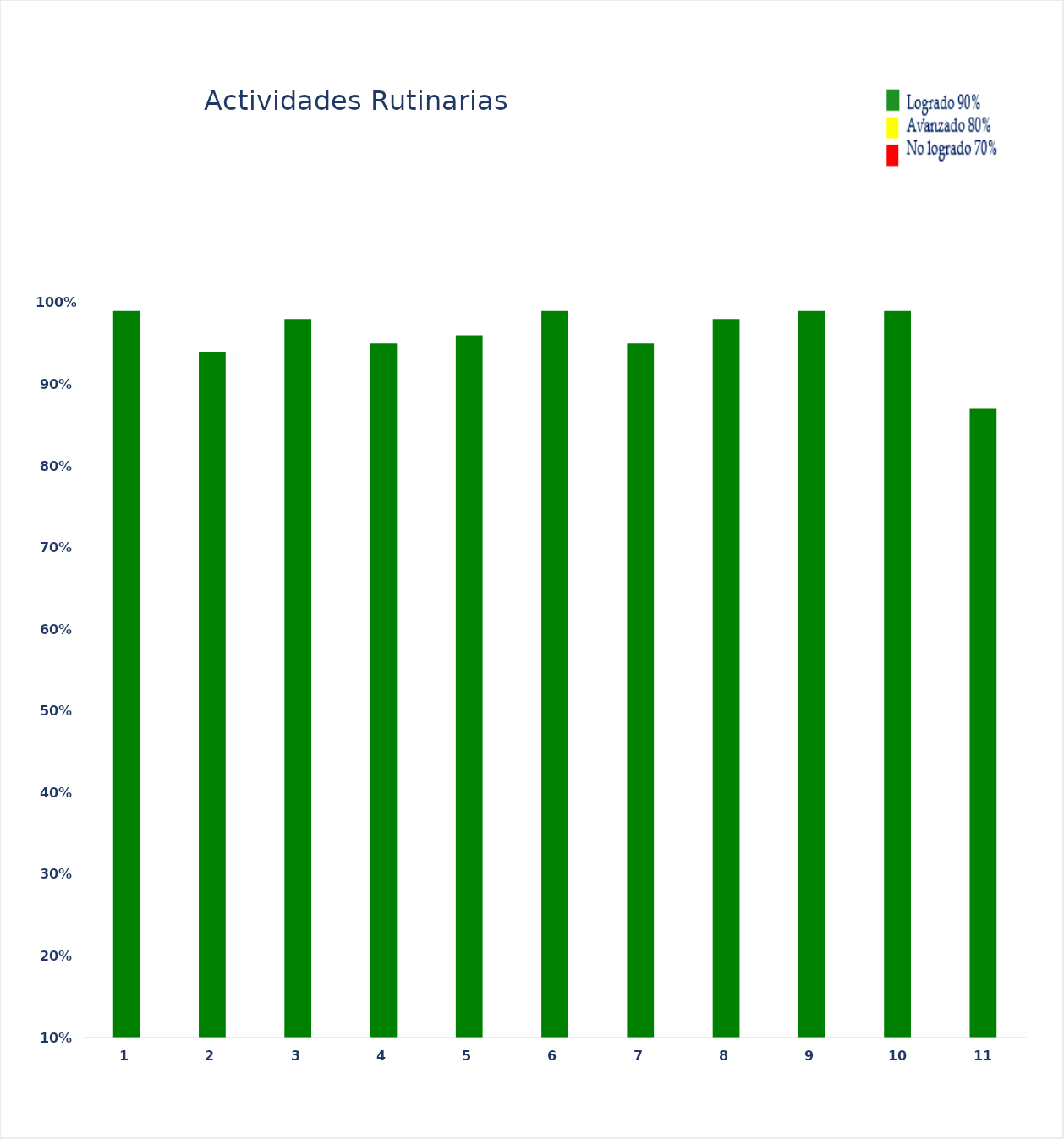
| Category | Series 0 |
|---|---|
| 0 | 0.99 |
| 1 | 0.94 |
| 2 | 0.98 |
| 3 | 0.95 |
| 4 | 0.96 |
| 5 | 0.99 |
| 6 | 0.95 |
| 7 | 0.98 |
| 8 | 0.99 |
| 9 | 0.99 |
| 10 | 0.87 |